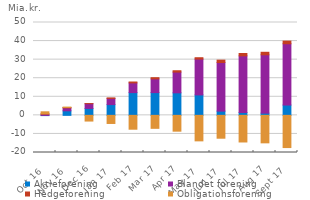
| Category | Aktieforening | Blandet forening | Hedgeforening | Obligationsforening |
|---|---|---|---|---|
| 2016-10-01 | -131399515.987 | 690879305.959 | 99623365.62 | 1122403399.047 |
| 2016-11-01 | 2443679751.504 | 1577222765.224 | 181159002.01 | 244474334.285 |
| 2016-12-01 | 3734236185.536 | 2545998964.218 | 43708981.64 | -3068568621.007 |
| 2017-01-01 | 5801576207.776 | 3313549216.321 | 273151926.82 | -4369557113.359 |
| 2017-02-01 | 12250335875.176 | 5229660134.256 | 482521833.765 | -7458389033.697 |
| 2017-03-01 | 12248707470.719 | 7401384044.673 | 634486888.98 | -6987460467.41 |
| 2017-04-01 | 12130975870.103 | 11163942151.766 | 728882750.875 | -8518892333.743 |
| 2017-05-01 | 11011749260.047 | 19295830841.303 | 727651996.48 | -13731158061.334 |
| 2017-06-01 | 2276291475.961 | 26168858090.795 | 1291285582.435 | -12305662113.701 |
| 2017-07-01 | 1551652512.672 | 30486449289.808 | 1272195927.145 | -14334993610.549 |
| 2017-08-01 | 1182433353.756 | 31427591998.023 | 1354277583.85 | -14797458563.861 |
| 2017-09-01 | 5557354748.498 | 32999420809.885 | 1418954681.24 | -17341316652.854 |